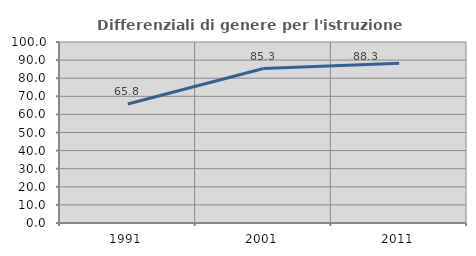
| Category | Differenziali di genere per l'istruzione superiore |
|---|---|
| 1991.0 | 65.781 |
| 2001.0 | 85.331 |
| 2011.0 | 88.298 |